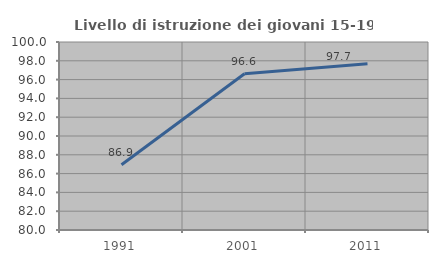
| Category | Livello di istruzione dei giovani 15-19 anni |
|---|---|
| 1991.0 | 86.935 |
| 2001.0 | 96.622 |
| 2011.0 | 97.674 |